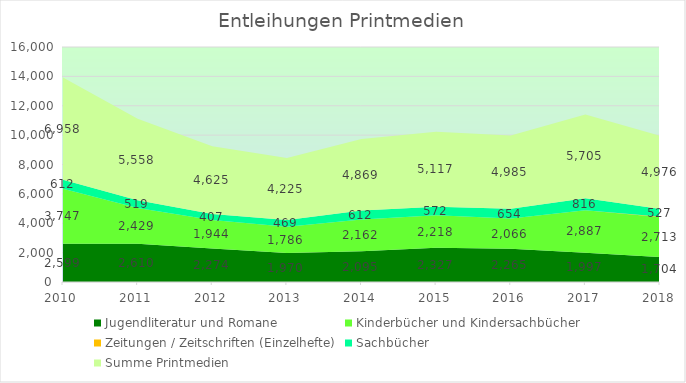
| Category | Jugendliteratur und Romane | Kinderbücher und Kindersachbücher | Zeitungen / Zeitschriften (Einzelhefte) | Sachbücher | Summe Printmedien |
|---|---|---|---|---|---|
| 2010.0 | 2599 | 3747 | 0 | 612 | 6958 |
| 2011.0 | 2610 | 2429 | 0 | 519 | 5558 |
| 2012.0 | 2274 | 1944 | 0 | 407 | 4625 |
| 2013.0 | 1970 | 1786 | 0 | 469 | 4225 |
| 2014.0 | 2095 | 2162 | 0 | 612 | 4869 |
| 2015.0 | 2327 | 2218 | 0 | 572 | 5117 |
| 2016.0 | 2265 | 2066 | 0 | 654 | 4985 |
| 2017.0 | 1997 | 2887 | 5 | 816 | 5705 |
| 2018.0 | 1704 | 2713 | 32 | 527 | 4976 |